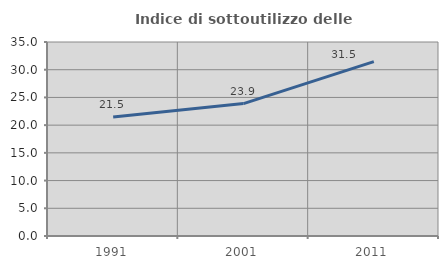
| Category | Indice di sottoutilizzo delle abitazioni  |
|---|---|
| 1991.0 | 21.454 |
| 2001.0 | 23.894 |
| 2011.0 | 31.454 |